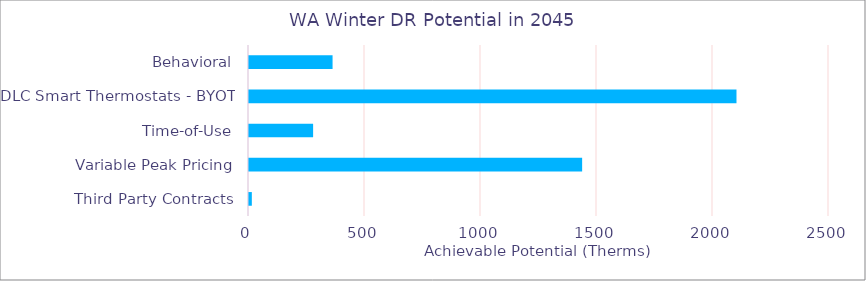
| Category | WA |
|---|---|
| Behavioral | 364.525 |
| DLC Smart Thermostats - BYOT | 2105.537 |
| Time-of-Use | 280.689 |
| Variable Peak Pricing | 1440.258 |
| Third Party Contracts | 16.488 |